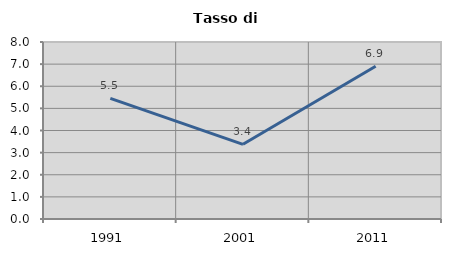
| Category | Tasso di disoccupazione   |
|---|---|
| 1991.0 | 5.453 |
| 2001.0 | 3.376 |
| 2011.0 | 6.905 |